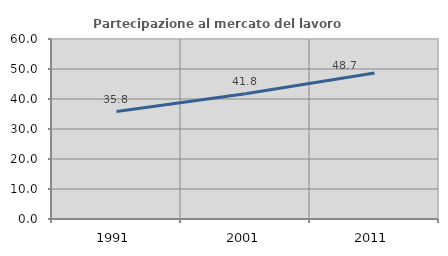
| Category | Partecipazione al mercato del lavoro  femminile |
|---|---|
| 1991.0 | 35.832 |
| 2001.0 | 41.76 |
| 2011.0 | 48.698 |